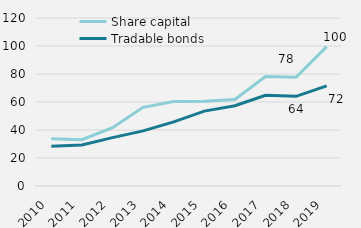
| Category | Share capital | Tradable bonds |
|---|---|---|
| 2010 | 33827.938 | 28412.19 |
| 2011 | 33092.585 | 29272.682 |
| 2012 | 41590.769 | 34535.708 |
| 2013 | 56166.195 | 39353.473 |
| 2014 | 60415.364 | 45757.894 |
| 2015 | 60621.101 | 53480.796 |
| 2016 | 61779.331 | 57368.679 |
| 2017 | 78224.236 | 64765.974 |
| 2018 | 77649.356 | 64054.856 |
| 2019 | 99573 | 71539 |